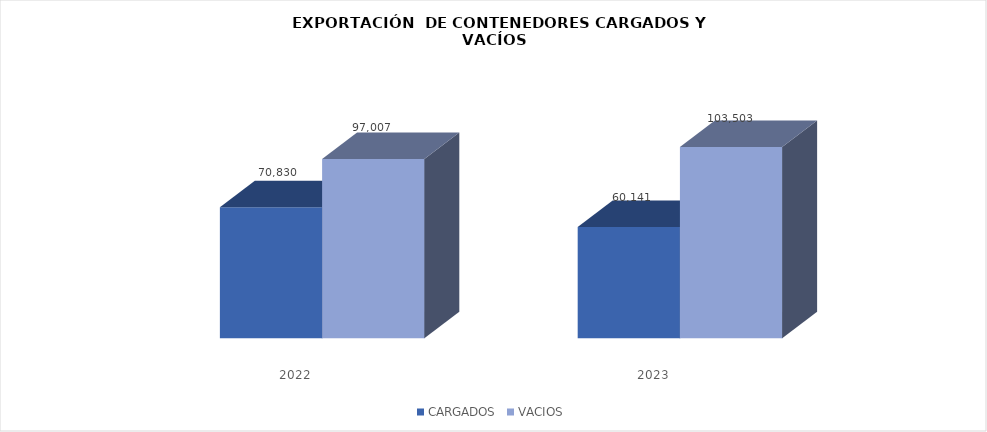
| Category | CARGADOS | VACIOS |
|---|---|---|
| 2022.0 | 70830 | 97007 |
| 2023.0 | 60141 | 103503 |